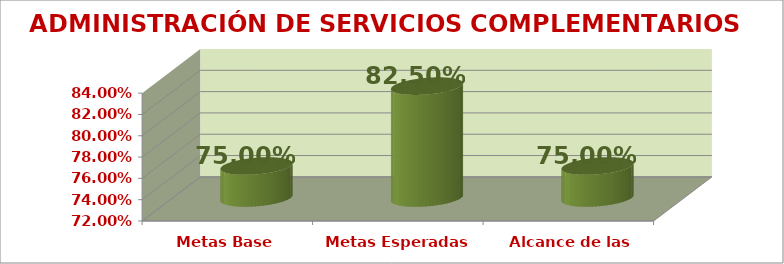
| Category | ADMINISTRACIÓN DE SERVICIOS COMPLEMENTARIOS |
|---|---|
| Metas Base | 0.75 |
| Metas Esperadas | 0.825 |
| Alcance de las Metas | 0.75 |